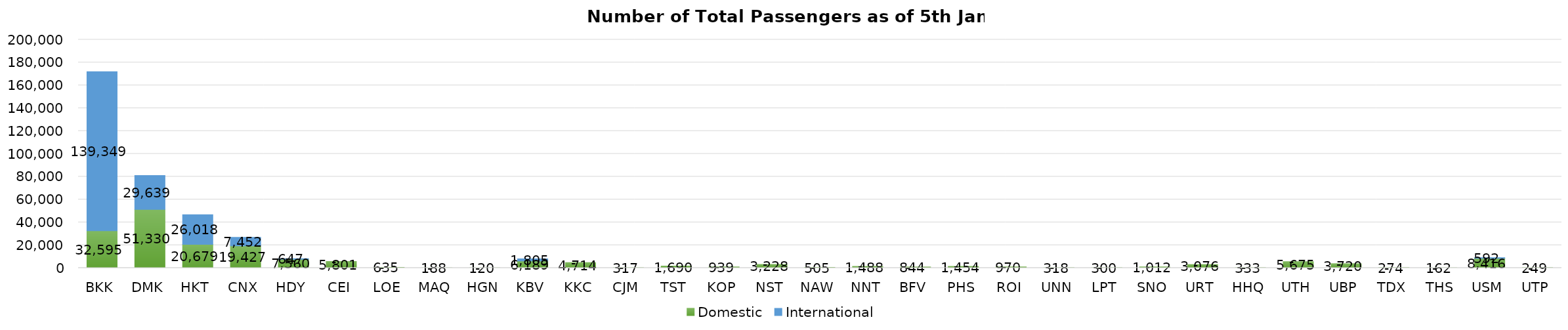
| Category | Domestic | International |
|---|---|---|
| BKK | 32595 | 139349 |
| DMK | 51330 | 29639 |
| HKT | 20679 | 26018 |
| CNX | 19427 | 7452 |
| HDY | 7560 | 647 |
| CEI | 5801 | 0 |
| LOE | 635 | 0 |
| MAQ | 188 | 0 |
| HGN | 120 | 0 |
| KBV | 6189 | 1805 |
| KKC | 4714 | 0 |
| CJM | 317 | 0 |
| TST | 1690 | 0 |
| KOP | 939 | 0 |
| NST | 3228 | 0 |
| NAW | 505 | 0 |
| NNT | 1488 | 0 |
| BFV | 844 | 0 |
| PHS | 1454 | 0 |
| ROI | 970 | 0 |
| UNN | 318 | 0 |
| LPT | 300 | 0 |
| SNO | 1012 | 0 |
| URT | 3076 | 0 |
| HHQ | 333 | 0 |
| UTH | 5675 | 0 |
| UBP | 3720 | 0 |
| TDX | 274 | 0 |
| THS | 162 | 0 |
| USM | 8416 | 592 |
| UTP | 249 | 0 |